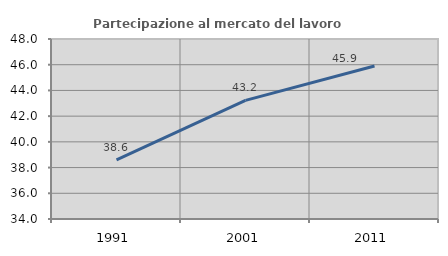
| Category | Partecipazione al mercato del lavoro  femminile |
|---|---|
| 1991.0 | 38.603 |
| 2001.0 | 43.227 |
| 2011.0 | 45.905 |